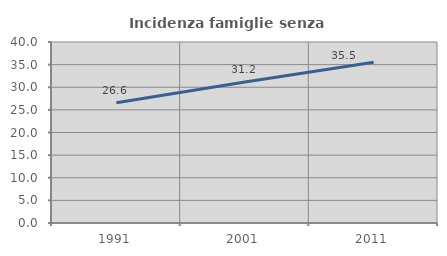
| Category | Incidenza famiglie senza nuclei |
|---|---|
| 1991.0 | 26.559 |
| 2001.0 | 31.172 |
| 2011.0 | 35.546 |